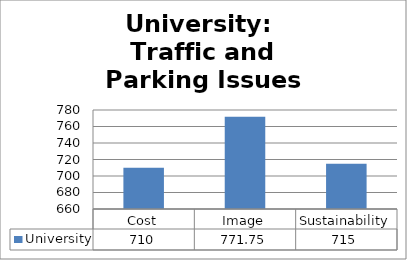
| Category | University |
|---|---|
| Cost | 710 |
| Image | 771.75 |
| Sustainability | 715 |